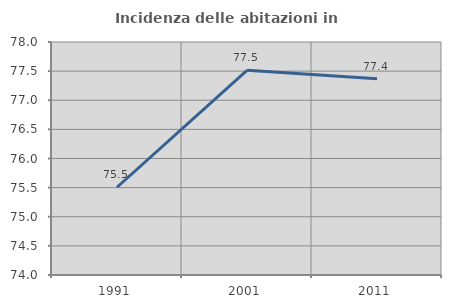
| Category | Incidenza delle abitazioni in proprietà  |
|---|---|
| 1991.0 | 75.506 |
| 2001.0 | 77.515 |
| 2011.0 | 77.37 |